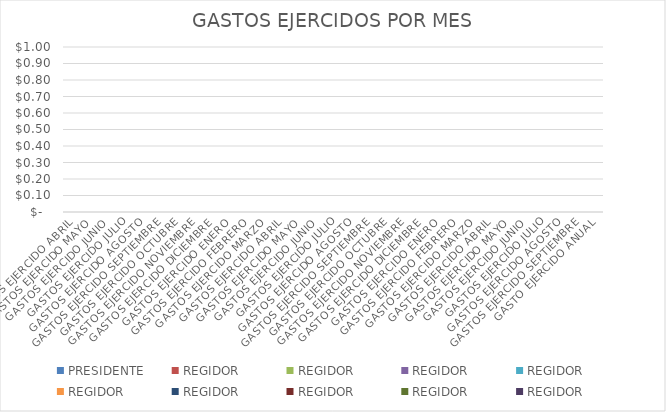
| Category | PRESIDENTE | REGIDOR |
|---|---|---|
| GASTOS EJERCIDO ABRIL | 0 | 0 |
| GASTOS EJERCIDO MAYO | 0 | 0 |
| GASTOS EJERCIDO JUNIO | 0 | 0 |
| GASTOS EJERCIDO JULIO | 0 | 0 |
| GASTOS EJERCIDO AGOSTO | 0 | 0 |
| GASTOS EJERCIDO SEPTIEMBRE | 0 | 0 |
| GASTOS EJERCIDO OCTUBRE | 0 | 0 |
| GASTOS EJERCIDO NOVIEMBRE | 0 | 0 |
| GASTOS EJERCIDO DICIEMBRE | 0 | 0 |
| GASTOS EJERCIDO ENERO | 0 | 0 |
| GASTOS EJERCIDO FEBRERO | 0 | 0 |
| GASTOS EJERCIDO MARZO | 0 | 0 |
| GASTOS EJERCIDO ABRIL | 0 | 0 |
| GASTOS EJERCIDO MAYO | 0 | 0 |
| GASTOS EJERCIDO JUNIO | 0 | 0 |
| GASTOS EJERCIDO JULIO | 0 | 0 |
| GASTOS EJERCIDO AGOSTO | 0 | 0 |
| GASTOS EJERCIDO SEPTIEMBRE | 0 | 0 |
| GASTOS EJERCIDO OCTUBRE | 0 | 0 |
| GASTOS EJERCIDO NOVIEMBRE | 0 | 0 |
| GASTOS EJERCIDO DICIEMBRE | 0 | 0 |
| GASTOS EJERCIDO ENERO | 0 | 0 |
| GASTOS EJERCIDO FEBRERO | 0 | 0 |
| GASTOS EJERCIDO MARZO | 0 | 0 |
| GASTOS EJERCIDO ABRIL | 0 | 0 |
| GASTOS EJERCIDO MAYO | 0 | 0 |
| GASTOS EJERCIDO JUNIO | 0 | 0 |
| GASTOS EJERCIDO JULIO | 0 | 0 |
| GASTOS EJERCIDO AGOSTO | 0 | 0 |
| GASTOS EJERCIDO SEPTIEMBRE | 0 | 0 |
| GASTO EJERCIDO ANUAL | 0 | 0 |